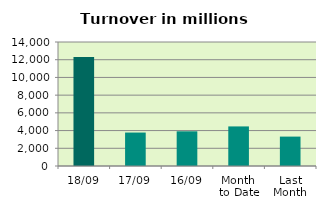
| Category | Series 0 |
|---|---|
| 18/09 | 12301.832 |
| 17/09 | 3776.289 |
| 16/09 | 3915.977 |
| Month 
to Date | 4468.834 |
| Last
Month | 3319.434 |